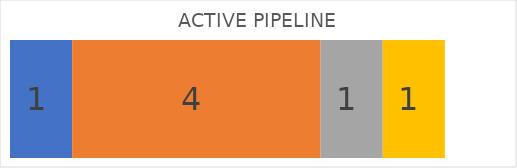
| Category | LEVEL-1 | LEVEL-2 | INTERVIEW | OFFER |
|---|---|---|---|---|
| 0 | 1 | 4 | 1 | 1 |